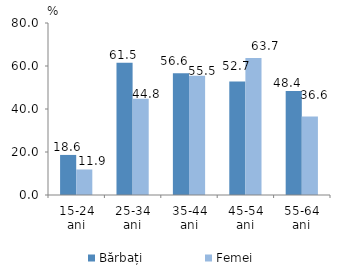
| Category | Bărbați | Femei |
|---|---|---|
| 15-24 ani | 18.637 | 11.873 |
| 25-34 ani | 61.454 | 44.793 |
| 35-44 ani | 56.577 | 55.502 |
| 45-54 ani | 52.744 | 63.679 |
| 55-64 ani | 48.417 | 36.569 |